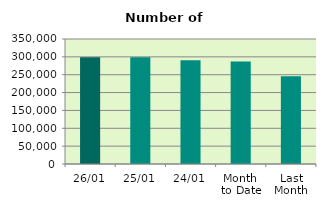
| Category | Series 0 |
|---|---|
| 26/01 | 298902 |
| 25/01 | 298992 |
| 24/01 | 290326 |
| Month 
to Date | 286739.053 |
| Last
Month | 245553.619 |